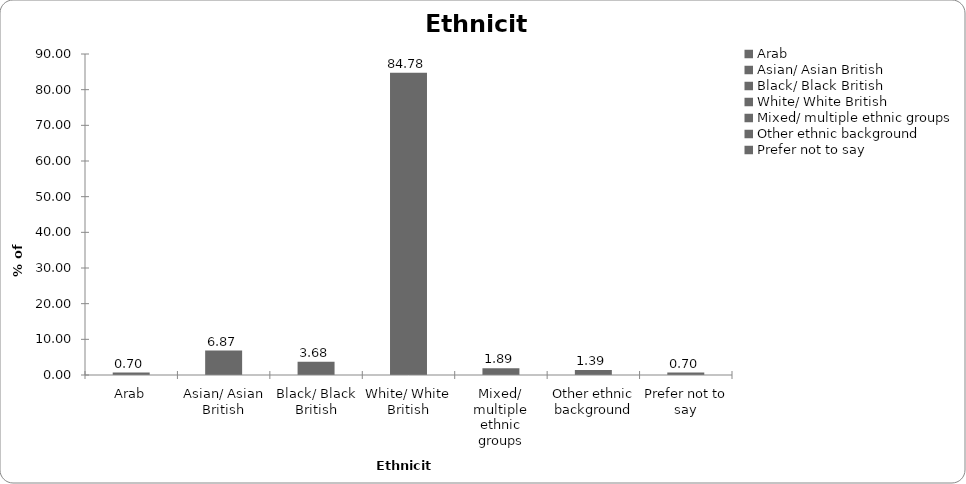
| Category | Ethnicity |
|---|---|
| Arab | 0.697 |
| Asian/ Asian British | 6.866 |
| Black/ Black British | 3.682 |
| White/ White British | 84.776 |
| Mixed/ multiple ethnic groups | 1.891 |
| Other ethnic background | 1.393 |
| Prefer not to say | 0.697 |